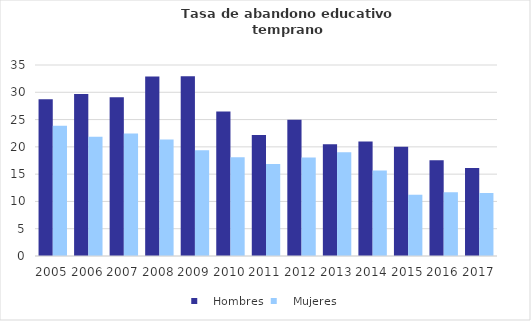
| Category |    Hombres |    Mujeres |
|---|---|---|
| 2005.0 | 28.743 | 23.884 |
| 2006.0 | 29.693 | 21.839 |
| 2007.0 | 29.068 | 22.456 |
| 2008.0 | 32.896 | 21.354 |
| 2009.0 | 32.94 | 19.372 |
| 2010.0 | 26.479 | 18.113 |
| 2011.0 | 22.187 | 16.87 |
| 2012.0 | 24.951 | 18.071 |
| 2013.0 | 20.482 | 18.997 |
| 2014.0 | 20.981 | 15.689 |
| 2015.0 | 20 | 11.226 |
| 2016.0 | 17.544 | 11.683 |
| 2017.0 | 16.132 | 11.543 |